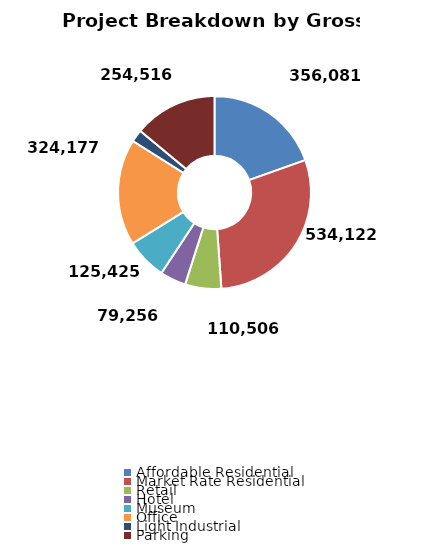
| Category | Series 0 |
|---|---|
| Affordable Residential | 356081.2 |
| Market Rate Residential | 534121.8 |
| Retail | 110506 |
| Hotel | 79256 |
| Museum | 125425 |
| Office | 324177 |
| Light Industrial | 37784 |
| Parking | 254516 |